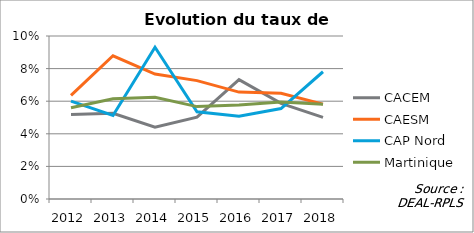
| Category | CACEM | CAESM | CAP Nord | Martinique |
|---|---|---|---|---|
| 2012.0 | 0.052 | 0.064 | 0.06 | 0.056 |
| 2013.0 | 0.053 | 0.088 | 0.051 | 0.061 |
| 2014.0 | 0.044 | 0.077 | 0.093 | 0.062 |
| 2015.0 | 0.05 | 0.073 | 0.054 | 0.057 |
| 2016.0 | 0.073 | 0.066 | 0.051 | 0.058 |
| 2017.0 | 0.059 | 0.065 | 0.055 | 0.059 |
| 2018.0 | 0.05 | 0.058 | 0.078 | 0.058 |